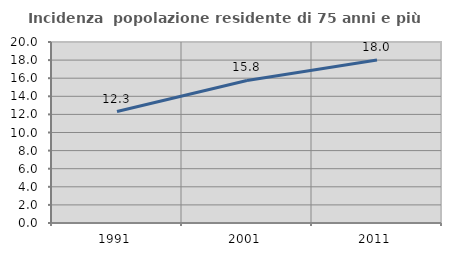
| Category | Incidenza  popolazione residente di 75 anni e più |
|---|---|
| 1991.0 | 12.318 |
| 2001.0 | 15.754 |
| 2011.0 | 18.016 |